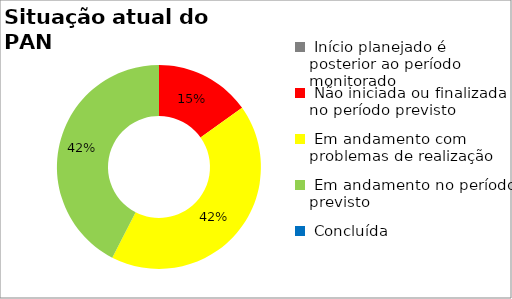
| Category | Series 0 |
|---|---|
|  Início planejado é posterior ao período monitorado | 0 |
|  Não iniciada ou finalizada no período previsto | 0.152 |
|  Em andamento com problemas de realização | 0.424 |
|  Em andamento no período previsto  | 0.424 |
|  Concluída | 0 |